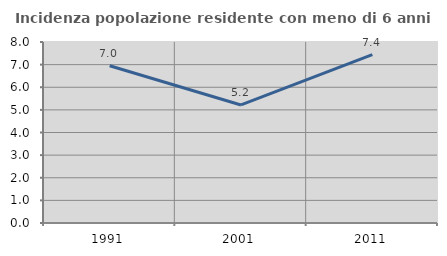
| Category | Incidenza popolazione residente con meno di 6 anni |
|---|---|
| 1991.0 | 6.953 |
| 2001.0 | 5.218 |
| 2011.0 | 7.445 |